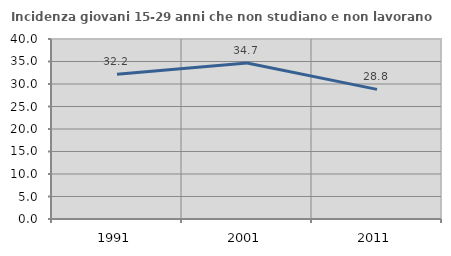
| Category | Incidenza giovani 15-29 anni che non studiano e non lavorano  |
|---|---|
| 1991.0 | 32.186 |
| 2001.0 | 34.679 |
| 2011.0 | 28.803 |